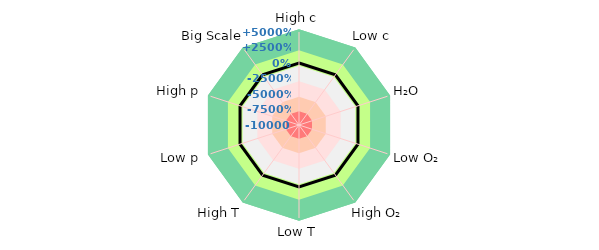
| Category | High c | Series 13 | Series 0 |
|---|---|---|---|
| High c | 37.5 | 0 | 0 |
| Low c | 37.5 | 0 | 0 |
| H₂O | 37.5 | 0 | 0 |
| Low O₂ | 37.5 | 0 | 0 |
| High O₂ | 37.5 | 0 | 0 |
| Low T | 37.5 | 0 | 0 |
| High T | 37.5 | 0 | 0 |
| Low p | 37.5 | 0 | 0 |
| High p | 37.5 | 0 | 0 |
| Big Scale | 37.5 | 0 | 0 |